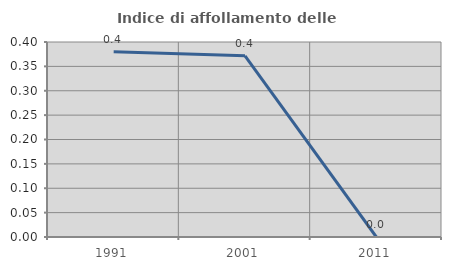
| Category | Indice di affollamento delle abitazioni  |
|---|---|
| 1991.0 | 0.38 |
| 2001.0 | 0.372 |
| 2011.0 | 0 |